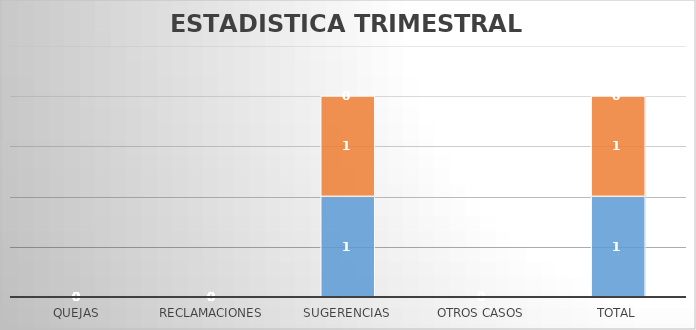
| Category | Series 0 | Series 1 | Series 2 |
|---|---|---|---|
| Quejas | 0 | 0 | 0 |
| Reclamaciones | 0 | 0 | 0 |
| Sugerencias | 1 | 1 | 0 |
| Otros casos | 0 | 0 | 0 |
| Total | 1 | 1 | 0 |